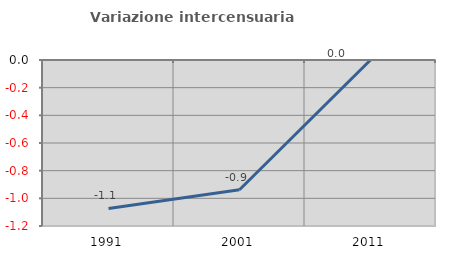
| Category | Variazione intercensuaria annua |
|---|---|
| 1991.0 | -1.073 |
| 2001.0 | -0.938 |
| 2011.0 | 0 |